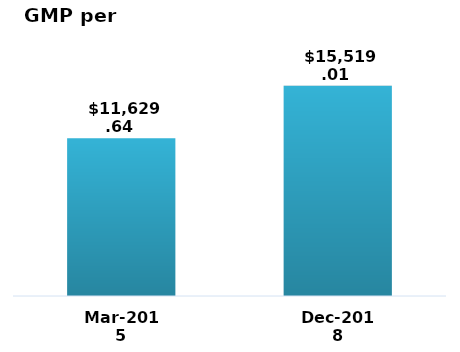
| Category | Graph |
|---|---|
| Mar-2015 | 11629.635 |
| Dec-2018 | 15519.009 |